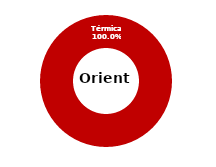
| Category | Oriente |
|---|---|
| Eólica | 0 |
| Hidráulica | 0 |
| Solar | 0 |
| Térmica | 45.058 |